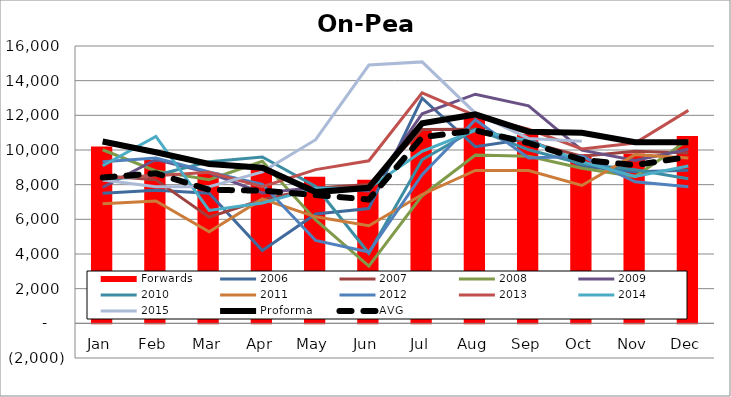
| Category | Forwards |
|---|---|
| Jan | 10197.649 |
| Feb | 9418.072 |
| Mar | 8696.742 |
| Apr | 8933.723 |
| May | 8461.03 |
| Jun | 8282.76 |
| Jul | 11146.171 |
| Aug | 11864.556 |
| Sep | 10912.565 |
| Oct | 9752.143 |
| Nov | 9791.786 |
| Dec | 10814.118 |